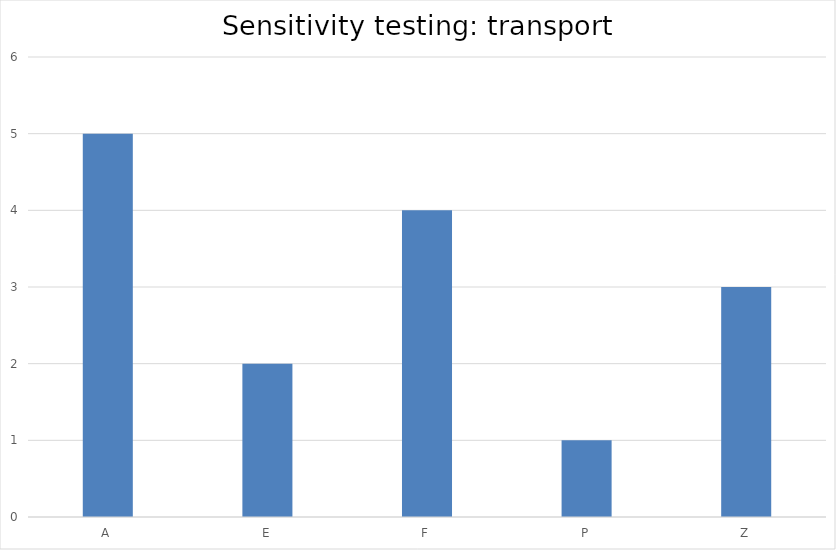
| Category | Series 0 |
|---|---|
| A | 5 |
| E | 2 |
| F | 4 |
| P | 1 |
| Z | 3 |